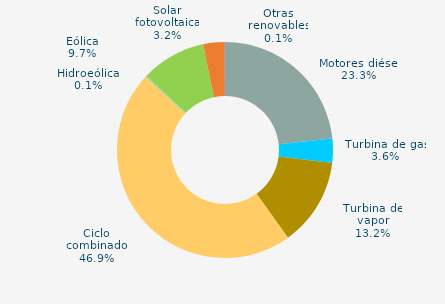
| Category | Series 0 |
|---|---|
| Motores diésel | 23.32 |
| Turbina de gas | 3.606 |
| Turbina de vapor | 13.151 |
| Ciclo combinado | 46.863 |
| Cogeneración | 0 |
| Hidráulica | 0.042 |
| Hidroeólica | 0.091 |
| Eólica | 9.656 |
| Solar fotovoltaica | 3.211 |
| Otras renovables | 0.061 |